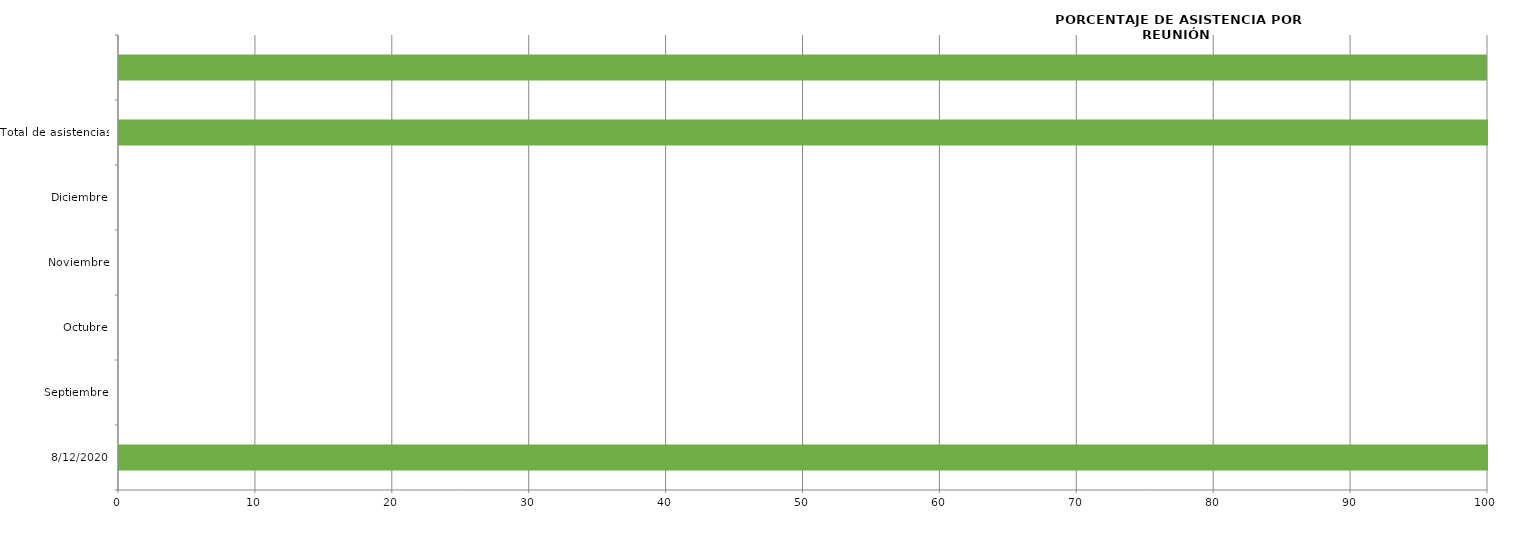
| Category | Series 0 |
|---|---|
| 12/08/2020 | 100 |
| Septiembre | 0 |
| Octubre | 0 |
| Noviembre | 0 |
| Diciembre | 0 |
| Total de asistencias | 100 |